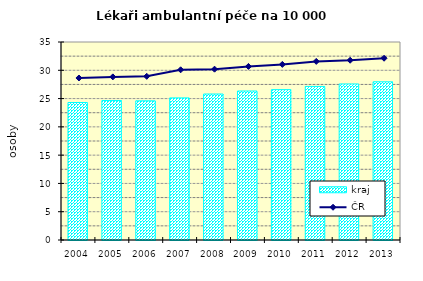
| Category | kraj |
|---|---|
| 2004.0 | 24.306 |
| 2005.0 | 24.655 |
| 2006.0 | 24.602 |
| 2007.0 | 25.119 |
| 2008.0 | 25.804 |
| 2009.0 | 26.338 |
| 2010.0 | 26.581 |
| 2011.0 | 27.146 |
| 2012.0 | 27.583 |
| 2013.0 | 27.963 |